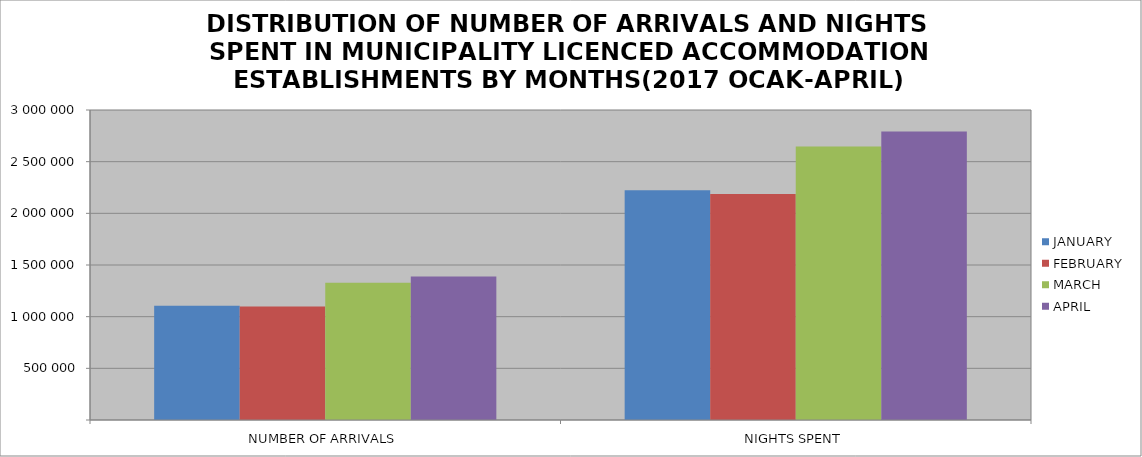
| Category | JANUARY | FEBRUARY | MARCH | APRIL |
|---|---|---|---|---|
| NUMBER OF ARRIVALS | 1104649 | 1099366 | 1327993 | 1389075 |
| NIGHTS SPENT | 2222261 | 2187982 | 2645959 | 2791881 |